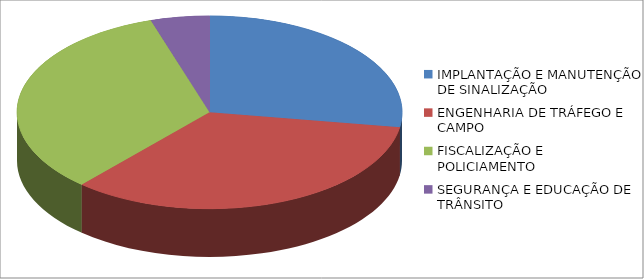
| Category | Series 0 | Series 1 |
|---|---|---|
| IMPLANTAÇÃO E MANUTENÇÃO DE SINALIZAÇÃO | 2575699.91 |  |
| ENGENHARIA DE TRÁFEGO E CAMPO | 3195125.67 |  |
| FISCALIZAÇÃO E POLICIAMENTO | 3144640.59 |  |
| SEGURANÇA E EDUCAÇÃO DE TRÂNSITO | 462321.9 |  |